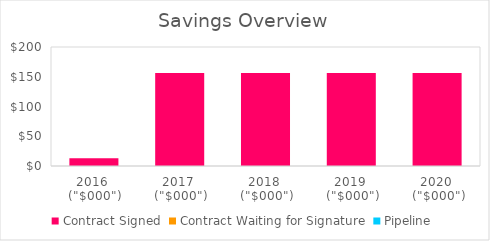
| Category | Contract Signed | Contract Waiting for Signature | Pipeline |
|---|---|---|---|
| 2016 
("$000") | 13027.42 | 0 | 0 |
| 2017 
("$000") | 156329.038 | 0 | 0 |
| 2018 
("$000") | 156329.038 | 0 | 0 |
| 2019 
("$000") | 156329.038 | 0 | 0 |
| 2020 
("$000") | 156329.038 | 0 | 0 |